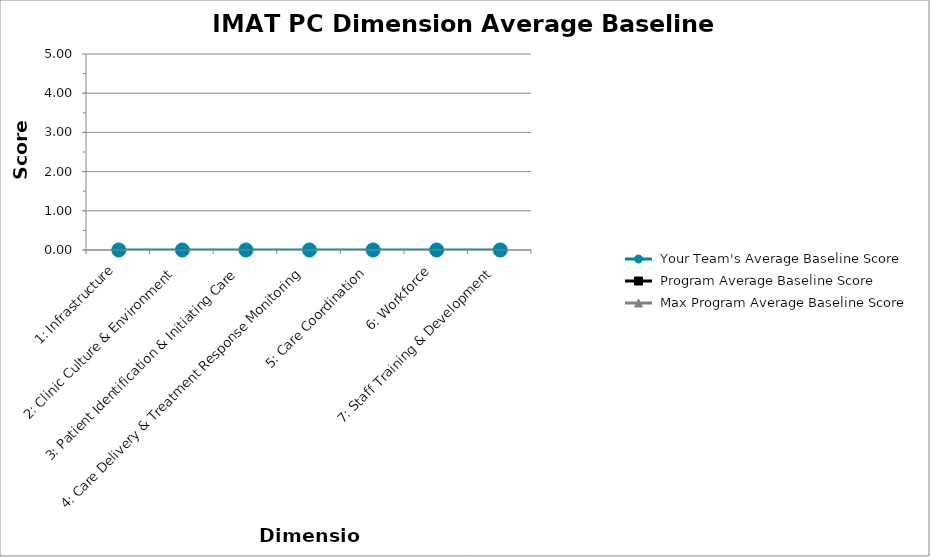
| Category |  Your Team's Average Baseline Score |  Program Average Baseline Score |  Max Program Average Baseline Score |
|---|---|---|---|
| 1: Infrastructure | 0 |  |  |
| 2: Clinic Culture & Environment | 0 |  |  |
| 3: Patient Identification & Initiating Care | 0 |  |  |
| 4: Care Delivery & Treatment Response Monitoring | 0 |  |  |
| 5: Care Coordination | 0 |  |  |
| 6: Workforce | 0 |  |  |
| 7: Staff Training & Development | 0 |  |  |